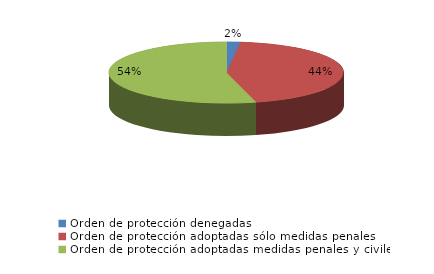
| Category | Series 0 |
|---|---|
| Orden de protección denegadas | 26 |
| Orden de protección adoptadas sólo medidas penales | 618 |
| Orden de protección adoptadas medidas penales y civiles | 757 |